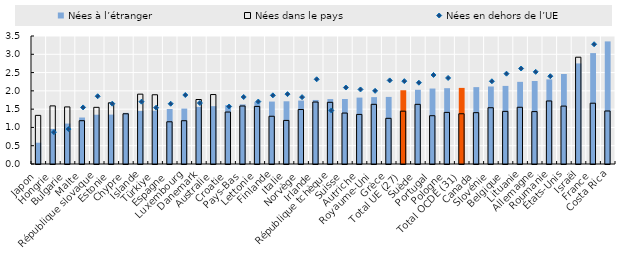
| Category | Nées à l’étranger | Nées dans le pays |
|---|---|---|
| Japon | 0.582 | 1.33 |
| Hongrie | 0.958 | 1.589 |
| Bulgarie | 1.105 | 1.561 |
| Malte | 1.271 | 1.184 |
| République slovaque | 1.348 | 1.55 |
| Estonie | 1.351 | 1.674 |
| Chypre | 1.399 | 1.374 |
| Islande | 1.451 | 1.909 |
| Türkiye | 1.457 | 1.893 |
| Espagne | 1.504 | 1.154 |
| Luxembourg | 1.515 | 1.183 |
| Danemark | 1.562 | 1.763 |
| Australie | 1.581 | 1.899 |
| Croatie | 1.609 | 1.421 |
| Pays-Bas | 1.63 | 1.586 |
| Lettonie | 1.698 | 1.575 |
| Finlande | 1.707 | 1.305 |
| Italie | 1.715 | 1.192 |
| Norvège | 1.735 | 1.49 |
| Irlande | 1.751 | 1.695 |
| République tchèque | 1.776 | 1.687 |
| Suisse | 1.778 | 1.393 |
| Autriche | 1.816 | 1.356 |
| Royaume-Uni | 1.828 | 1.632 |
| Grèce | 1.834 | 1.249 |
| Total UE (27) | 2.017 | 1.444 |
| Suède | 2.03 | 1.631 |
| Portugal | 2.064 | 1.32 |
| Pologne | 2.073 | 1.411 |
| Total OCDE (31) | 2.081 | 1.374 |
| Canada | 2.102 | 1.404 |
| Slovénie | 2.12 | 1.539 |
| Belgique | 2.135 | 1.439 |
| Lituanie | 2.247 | 1.551 |
| Allemagne | 2.269 | 1.433 |
| Roumanie | 2.314 | 1.723 |
| États-Unis | 2.461 | 1.583 |
| Israël | 2.75 | 2.92 |
| France | 3.033 | 1.662 |
| Costa Rica | 3.352 | 1.45 |